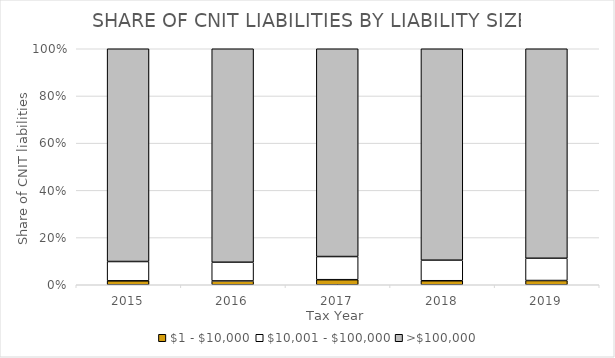
| Category | $1 - $10,000 | $10,001 - $100,000 | >$100,000 |
|---|---|---|---|
| 2015.0 | 42.369 | 207.993 | 2292.563 |
| 2016.0 | 41.92 | 205.384 | 2345.885 |
| 2017.0 | 55.632 | 254.663 | 2285.137 |
| 2018.0 | 56.019 | 287.478 | 2957.088 |
| 2019.0 | 53.658 | 282.288 | 2656.127 |